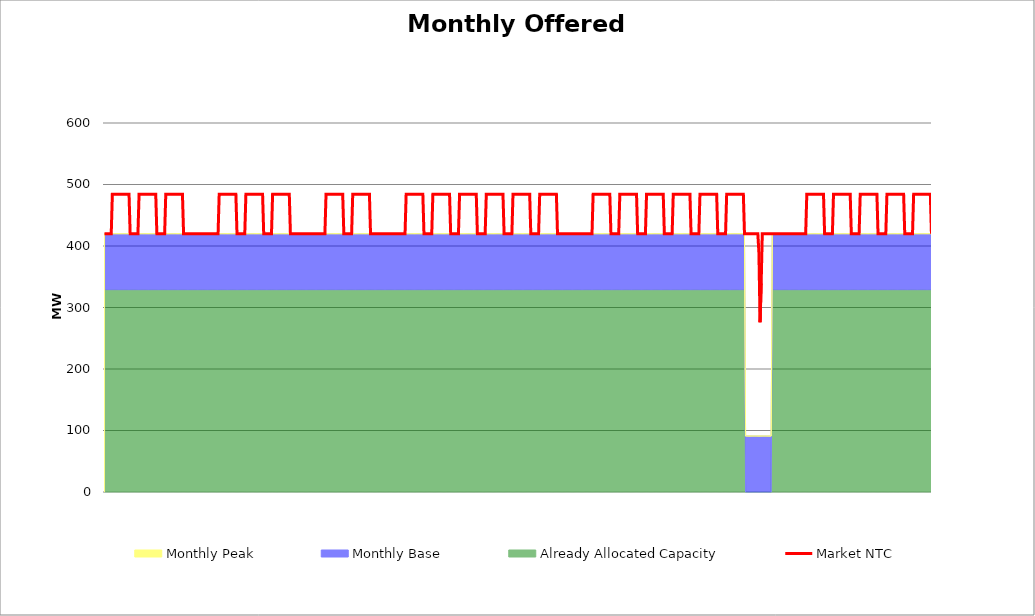
| Category | Market NTC |
|---|---|
| 0 | 420 |
| 1 | 420 |
| 2 | 420 |
| 3 | 420 |
| 4 | 420 |
| 5 | 420 |
| 6 | 420 |
| 7 | 484 |
| 8 | 484 |
| 9 | 484 |
| 10 | 484 |
| 11 | 484 |
| 12 | 484 |
| 13 | 484 |
| 14 | 484 |
| 15 | 484 |
| 16 | 484 |
| 17 | 484 |
| 18 | 484 |
| 19 | 484 |
| 20 | 484 |
| 21 | 484 |
| 22 | 484 |
| 23 | 420 |
| 24 | 420 |
| 25 | 420 |
| 26 | 420 |
| 27 | 420 |
| 28 | 420 |
| 29 | 420 |
| 30 | 420 |
| 31 | 484 |
| 32 | 484 |
| 33 | 484 |
| 34 | 484 |
| 35 | 484 |
| 36 | 484 |
| 37 | 484 |
| 38 | 484 |
| 39 | 484 |
| 40 | 484 |
| 41 | 484 |
| 42 | 484 |
| 43 | 484 |
| 44 | 484 |
| 45 | 484 |
| 46 | 484 |
| 47 | 420 |
| 48 | 420 |
| 49 | 420 |
| 50 | 420 |
| 51 | 420 |
| 52 | 420 |
| 53 | 420 |
| 54 | 420 |
| 55 | 484 |
| 56 | 484 |
| 57 | 484 |
| 58 | 484 |
| 59 | 484 |
| 60 | 484 |
| 61 | 484 |
| 62 | 484 |
| 63 | 484 |
| 64 | 484 |
| 65 | 484 |
| 66 | 484 |
| 67 | 484 |
| 68 | 484 |
| 69 | 484 |
| 70 | 484 |
| 71 | 420 |
| 72 | 420 |
| 73 | 420 |
| 74 | 420 |
| 75 | 420 |
| 76 | 420 |
| 77 | 420 |
| 78 | 420 |
| 79 | 420 |
| 80 | 420 |
| 81 | 420 |
| 82 | 420 |
| 83 | 420 |
| 84 | 420 |
| 85 | 420 |
| 86 | 420 |
| 87 | 420 |
| 88 | 420 |
| 89 | 420 |
| 90 | 420 |
| 91 | 420 |
| 92 | 420 |
| 93 | 420 |
| 94 | 420 |
| 95 | 420 |
| 96 | 420 |
| 97 | 420 |
| 98 | 420 |
| 99 | 420 |
| 100 | 420 |
| 101 | 420 |
| 102 | 420 |
| 103 | 484 |
| 104 | 484 |
| 105 | 484 |
| 106 | 484 |
| 107 | 484 |
| 108 | 484 |
| 109 | 484 |
| 110 | 484 |
| 111 | 484 |
| 112 | 484 |
| 113 | 484 |
| 114 | 484 |
| 115 | 484 |
| 116 | 484 |
| 117 | 484 |
| 118 | 484 |
| 119 | 420 |
| 120 | 420 |
| 121 | 420 |
| 122 | 420 |
| 123 | 420 |
| 124 | 420 |
| 125 | 420 |
| 126 | 420 |
| 127 | 484 |
| 128 | 484 |
| 129 | 484 |
| 130 | 484 |
| 131 | 484 |
| 132 | 484 |
| 133 | 484 |
| 134 | 484 |
| 135 | 484 |
| 136 | 484 |
| 137 | 484 |
| 138 | 484 |
| 139 | 484 |
| 140 | 484 |
| 141 | 484 |
| 142 | 484 |
| 143 | 420 |
| 144 | 420 |
| 145 | 420 |
| 146 | 420 |
| 147 | 420 |
| 148 | 420 |
| 149 | 420 |
| 150 | 420 |
| 151 | 484 |
| 152 | 484 |
| 153 | 484 |
| 154 | 484 |
| 155 | 484 |
| 156 | 484 |
| 157 | 484 |
| 158 | 484 |
| 159 | 484 |
| 160 | 484 |
| 161 | 484 |
| 162 | 484 |
| 163 | 484 |
| 164 | 484 |
| 165 | 484 |
| 166 | 484 |
| 167 | 420 |
| 168 | 420 |
| 169 | 420 |
| 170 | 420 |
| 171 | 420 |
| 172 | 420 |
| 173 | 420 |
| 174 | 420 |
| 175 | 420 |
| 176 | 420 |
| 177 | 420 |
| 178 | 420 |
| 179 | 420 |
| 180 | 420 |
| 181 | 420 |
| 182 | 420 |
| 183 | 420 |
| 184 | 420 |
| 185 | 420 |
| 186 | 420 |
| 187 | 420 |
| 188 | 420 |
| 189 | 420 |
| 190 | 420 |
| 191 | 420 |
| 192 | 420 |
| 193 | 420 |
| 194 | 420 |
| 195 | 420 |
| 196 | 420 |
| 197 | 420 |
| 198 | 420 |
| 199 | 484 |
| 200 | 484 |
| 201 | 484 |
| 202 | 484 |
| 203 | 484 |
| 204 | 484 |
| 205 | 484 |
| 206 | 484 |
| 207 | 484 |
| 208 | 484 |
| 209 | 484 |
| 210 | 484 |
| 211 | 484 |
| 212 | 484 |
| 213 | 484 |
| 214 | 484 |
| 215 | 420 |
| 216 | 420 |
| 217 | 420 |
| 218 | 420 |
| 219 | 420 |
| 220 | 420 |
| 221 | 420 |
| 222 | 420 |
| 223 | 484 |
| 224 | 484 |
| 225 | 484 |
| 226 | 484 |
| 227 | 484 |
| 228 | 484 |
| 229 | 484 |
| 230 | 484 |
| 231 | 484 |
| 232 | 484 |
| 233 | 484 |
| 234 | 484 |
| 235 | 484 |
| 236 | 484 |
| 237 | 484 |
| 238 | 484 |
| 239 | 420 |
| 240 | 420 |
| 241 | 420 |
| 242 | 420 |
| 243 | 420 |
| 244 | 420 |
| 245 | 420 |
| 246 | 420 |
| 247 | 420 |
| 248 | 420 |
| 249 | 420 |
| 250 | 420 |
| 251 | 420 |
| 252 | 420 |
| 253 | 420 |
| 254 | 420 |
| 255 | 420 |
| 256 | 420 |
| 257 | 420 |
| 258 | 420 |
| 259 | 420 |
| 260 | 420 |
| 261 | 420 |
| 262 | 420 |
| 263 | 420 |
| 264 | 420 |
| 265 | 420 |
| 266 | 420 |
| 267 | 420 |
| 268 | 420 |
| 269 | 420 |
| 270 | 420 |
| 271 | 484 |
| 272 | 484 |
| 273 | 484 |
| 274 | 484 |
| 275 | 484 |
| 276 | 484 |
| 277 | 484 |
| 278 | 484 |
| 279 | 484 |
| 280 | 484 |
| 281 | 484 |
| 282 | 484 |
| 283 | 484 |
| 284 | 484 |
| 285 | 484 |
| 286 | 484 |
| 287 | 420 |
| 288 | 420 |
| 289 | 420 |
| 290 | 420 |
| 291 | 420 |
| 292 | 420 |
| 293 | 420 |
| 294 | 420 |
| 295 | 484 |
| 296 | 484 |
| 297 | 484 |
| 298 | 484 |
| 299 | 484 |
| 300 | 484 |
| 301 | 484 |
| 302 | 484 |
| 303 | 484 |
| 304 | 484 |
| 305 | 484 |
| 306 | 484 |
| 307 | 484 |
| 308 | 484 |
| 309 | 484 |
| 310 | 484 |
| 311 | 420 |
| 312 | 420 |
| 313 | 420 |
| 314 | 420 |
| 315 | 420 |
| 316 | 420 |
| 317 | 420 |
| 318 | 420 |
| 319 | 484 |
| 320 | 484 |
| 321 | 484 |
| 322 | 484 |
| 323 | 484 |
| 324 | 484 |
| 325 | 484 |
| 326 | 484 |
| 327 | 484 |
| 328 | 484 |
| 329 | 484 |
| 330 | 484 |
| 331 | 484 |
| 332 | 484 |
| 333 | 484 |
| 334 | 484 |
| 335 | 420 |
| 336 | 420 |
| 337 | 420 |
| 338 | 420 |
| 339 | 420 |
| 340 | 420 |
| 341 | 420 |
| 342 | 420 |
| 343 | 484 |
| 344 | 484 |
| 345 | 484 |
| 346 | 484 |
| 347 | 484 |
| 348 | 484 |
| 349 | 484 |
| 350 | 484 |
| 351 | 484 |
| 352 | 484 |
| 353 | 484 |
| 354 | 484 |
| 355 | 484 |
| 356 | 484 |
| 357 | 484 |
| 358 | 484 |
| 359 | 420 |
| 360 | 420 |
| 361 | 420 |
| 362 | 420 |
| 363 | 420 |
| 364 | 420 |
| 365 | 420 |
| 366 | 420 |
| 367 | 484 |
| 368 | 484 |
| 369 | 484 |
| 370 | 484 |
| 371 | 484 |
| 372 | 484 |
| 373 | 484 |
| 374 | 484 |
| 375 | 484 |
| 376 | 484 |
| 377 | 484 |
| 378 | 484 |
| 379 | 484 |
| 380 | 484 |
| 381 | 484 |
| 382 | 484 |
| 383 | 420 |
| 384 | 420 |
| 385 | 420 |
| 386 | 420 |
| 387 | 420 |
| 388 | 420 |
| 389 | 420 |
| 390 | 420 |
| 391 | 484 |
| 392 | 484 |
| 393 | 484 |
| 394 | 484 |
| 395 | 484 |
| 396 | 484 |
| 397 | 484 |
| 398 | 484 |
| 399 | 484 |
| 400 | 484 |
| 401 | 484 |
| 402 | 484 |
| 403 | 484 |
| 404 | 484 |
| 405 | 484 |
| 406 | 484 |
| 407 | 420 |
| 408 | 420 |
| 409 | 420 |
| 410 | 420 |
| 411 | 420 |
| 412 | 420 |
| 413 | 420 |
| 414 | 420 |
| 415 | 420 |
| 416 | 420 |
| 417 | 420 |
| 418 | 420 |
| 419 | 420 |
| 420 | 420 |
| 421 | 420 |
| 422 | 420 |
| 423 | 420 |
| 424 | 420 |
| 425 | 420 |
| 426 | 420 |
| 427 | 420 |
| 428 | 420 |
| 429 | 420 |
| 430 | 420 |
| 431 | 420 |
| 432 | 420 |
| 433 | 420 |
| 434 | 420 |
| 435 | 420 |
| 436 | 420 |
| 437 | 420 |
| 438 | 420 |
| 439 | 484 |
| 440 | 484 |
| 441 | 484 |
| 442 | 484 |
| 443 | 484 |
| 444 | 484 |
| 445 | 484 |
| 446 | 484 |
| 447 | 484 |
| 448 | 484 |
| 449 | 484 |
| 450 | 484 |
| 451 | 484 |
| 452 | 484 |
| 453 | 484 |
| 454 | 484 |
| 455 | 420 |
| 456 | 420 |
| 457 | 420 |
| 458 | 420 |
| 459 | 420 |
| 460 | 420 |
| 461 | 420 |
| 462 | 420 |
| 463 | 484 |
| 464 | 484 |
| 465 | 484 |
| 466 | 484 |
| 467 | 484 |
| 468 | 484 |
| 469 | 484 |
| 470 | 484 |
| 471 | 484 |
| 472 | 484 |
| 473 | 484 |
| 474 | 484 |
| 475 | 484 |
| 476 | 484 |
| 477 | 484 |
| 478 | 484 |
| 479 | 420 |
| 480 | 420 |
| 481 | 420 |
| 482 | 420 |
| 483 | 420 |
| 484 | 420 |
| 485 | 420 |
| 486 | 420 |
| 487 | 484 |
| 488 | 484 |
| 489 | 484 |
| 490 | 484 |
| 491 | 484 |
| 492 | 484 |
| 493 | 484 |
| 494 | 484 |
| 495 | 484 |
| 496 | 484 |
| 497 | 484 |
| 498 | 484 |
| 499 | 484 |
| 500 | 484 |
| 501 | 484 |
| 502 | 484 |
| 503 | 420 |
| 504 | 420 |
| 505 | 420 |
| 506 | 420 |
| 507 | 420 |
| 508 | 420 |
| 509 | 420 |
| 510 | 420 |
| 511 | 484 |
| 512 | 484 |
| 513 | 484 |
| 514 | 484 |
| 515 | 484 |
| 516 | 484 |
| 517 | 484 |
| 518 | 484 |
| 519 | 484 |
| 520 | 484 |
| 521 | 484 |
| 522 | 484 |
| 523 | 484 |
| 524 | 484 |
| 525 | 484 |
| 526 | 484 |
| 527 | 420 |
| 528 | 420 |
| 529 | 420 |
| 530 | 420 |
| 531 | 420 |
| 532 | 420 |
| 533 | 420 |
| 534 | 420 |
| 535 | 484 |
| 536 | 484 |
| 537 | 484 |
| 538 | 484 |
| 539 | 484 |
| 540 | 484 |
| 541 | 484 |
| 542 | 484 |
| 543 | 484 |
| 544 | 484 |
| 545 | 484 |
| 546 | 484 |
| 547 | 484 |
| 548 | 484 |
| 549 | 484 |
| 550 | 484 |
| 551 | 420 |
| 552 | 420 |
| 553 | 420 |
| 554 | 420 |
| 555 | 420 |
| 556 | 420 |
| 557 | 420 |
| 558 | 420 |
| 559 | 484 |
| 560 | 484 |
| 561 | 484 |
| 562 | 484 |
| 563 | 484 |
| 564 | 484 |
| 565 | 484 |
| 566 | 484 |
| 567 | 484 |
| 568 | 484 |
| 569 | 484 |
| 570 | 484 |
| 571 | 484 |
| 572 | 484 |
| 573 | 484 |
| 574 | 484 |
| 575 | 420 |
| 576 | 420 |
| 577 | 420 |
| 578 | 420 |
| 579 | 420 |
| 580 | 420 |
| 581 | 420 |
| 582 | 420 |
| 583 | 420 |
| 584 | 420 |
| 585 | 420 |
| 586 | 420 |
| 587 | 420 |
| 588 | 388 |
| 589 | 276 |
| 590 | 339 |
| 591 | 420 |
| 592 | 420 |
| 593 | 420 |
| 594 | 420 |
| 595 | 420 |
| 596 | 420 |
| 597 | 420 |
| 598 | 420 |
| 599 | 420 |
| 600 | 420 |
| 601 | 420 |
| 602 | 420 |
| 603 | 420 |
| 604 | 420 |
| 605 | 420 |
| 606 | 420 |
| 607 | 420 |
| 608 | 420 |
| 609 | 420 |
| 610 | 420 |
| 611 | 420 |
| 612 | 420 |
| 613 | 420 |
| 614 | 420 |
| 615 | 420 |
| 616 | 420 |
| 617 | 420 |
| 618 | 420 |
| 619 | 420 |
| 620 | 420 |
| 621 | 420 |
| 622 | 420 |
| 623 | 420 |
| 624 | 420 |
| 625 | 420 |
| 626 | 420 |
| 627 | 420 |
| 628 | 420 |
| 629 | 420 |
| 630 | 420 |
| 631 | 484 |
| 632 | 484 |
| 633 | 484 |
| 634 | 484 |
| 635 | 484 |
| 636 | 484 |
| 637 | 484 |
| 638 | 484 |
| 639 | 484 |
| 640 | 484 |
| 641 | 484 |
| 642 | 484 |
| 643 | 484 |
| 644 | 484 |
| 645 | 484 |
| 646 | 484 |
| 647 | 420 |
| 648 | 420 |
| 649 | 420 |
| 650 | 420 |
| 651 | 420 |
| 652 | 420 |
| 653 | 420 |
| 654 | 420 |
| 655 | 484 |
| 656 | 484 |
| 657 | 484 |
| 658 | 484 |
| 659 | 484 |
| 660 | 484 |
| 661 | 484 |
| 662 | 484 |
| 663 | 484 |
| 664 | 484 |
| 665 | 484 |
| 666 | 484 |
| 667 | 484 |
| 668 | 484 |
| 669 | 484 |
| 670 | 484 |
| 671 | 420 |
| 672 | 420 |
| 673 | 420 |
| 674 | 420 |
| 675 | 420 |
| 676 | 420 |
| 677 | 420 |
| 678 | 420 |
| 679 | 484 |
| 680 | 484 |
| 681 | 484 |
| 682 | 484 |
| 683 | 484 |
| 684 | 484 |
| 685 | 484 |
| 686 | 484 |
| 687 | 484 |
| 688 | 484 |
| 689 | 484 |
| 690 | 484 |
| 691 | 484 |
| 692 | 484 |
| 693 | 484 |
| 694 | 484 |
| 695 | 420 |
| 696 | 420 |
| 697 | 420 |
| 698 | 420 |
| 699 | 420 |
| 700 | 420 |
| 701 | 420 |
| 702 | 420 |
| 703 | 484 |
| 704 | 484 |
| 705 | 484 |
| 706 | 484 |
| 707 | 484 |
| 708 | 484 |
| 709 | 484 |
| 710 | 484 |
| 711 | 484 |
| 712 | 484 |
| 713 | 484 |
| 714 | 484 |
| 715 | 484 |
| 716 | 484 |
| 717 | 484 |
| 718 | 484 |
| 719 | 420 |
| 720 | 420 |
| 721 | 420 |
| 722 | 420 |
| 723 | 420 |
| 724 | 420 |
| 725 | 420 |
| 726 | 420 |
| 727 | 484 |
| 728 | 484 |
| 729 | 484 |
| 730 | 484 |
| 731 | 484 |
| 732 | 484 |
| 733 | 484 |
| 734 | 484 |
| 735 | 484 |
| 736 | 484 |
| 737 | 484 |
| 738 | 484 |
| 739 | 484 |
| 740 | 484 |
| 741 | 484 |
| 742 | 484 |
| 743 | 420 |